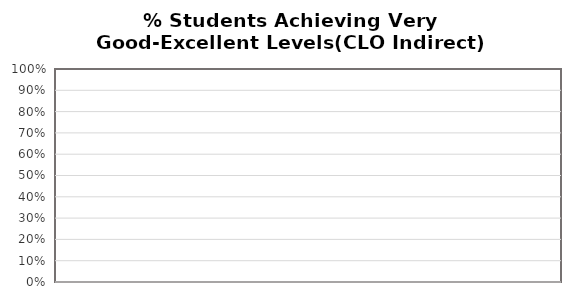
| Category | Course Learning Outcome |
|---|---|
| 0 | 0 |
| 1 | 0 |
| 2 | 0 |
| 3 | 0 |
| 4 | 0 |
| 5 | 0 |
| 6 | 0 |
| 7 | 0 |
| 8 | 0 |